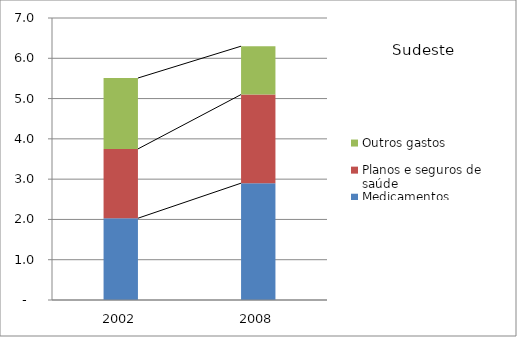
| Category | Medicamentos | Planos e seguros de saúde | Outros gastos |
|---|---|---|---|
| 2002.0 | 2.03 | 1.72 | 1.76 |
| 2008.0 | 2.9 | 2.2 | 1.2 |